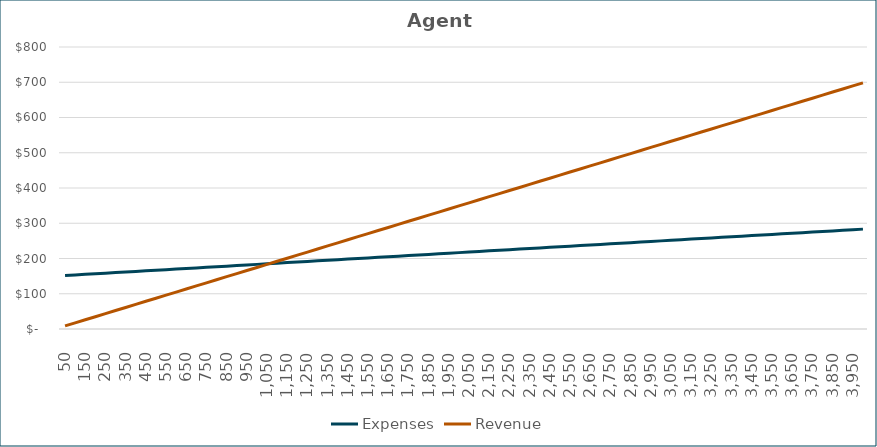
| Category | Expenses | Revenue |
|---|---|---|
| 50.0 | 151.667 | 8.73 |
| 100.0 | 153.333 | 17.46 |
| 150.0 | 155 | 26.19 |
| 200.0 | 156.667 | 34.92 |
| 250.0 | 158.333 | 43.65 |
| 300.0 | 160 | 52.38 |
| 350.0 | 161.667 | 61.11 |
| 400.0 | 163.333 | 69.84 |
| 450.0 | 165 | 78.57 |
| 500.0 | 166.667 | 87.3 |
| 550.0 | 168.333 | 96.03 |
| 600.0 | 170 | 104.76 |
| 650.0 | 171.667 | 113.49 |
| 700.0 | 173.333 | 122.22 |
| 750.0 | 175 | 130.95 |
| 800.0 | 176.667 | 139.68 |
| 850.0 | 178.333 | 148.41 |
| 900.0 | 180 | 157.14 |
| 950.0 | 181.667 | 165.87 |
| 1000.0 | 183.333 | 174.6 |
| 1050.0 | 185 | 183.33 |
| 1100.0 | 186.667 | 192.06 |
| 1150.0 | 188.333 | 200.79 |
| 1200.0 | 190 | 209.52 |
| 1250.0 | 191.667 | 218.25 |
| 1300.0 | 193.333 | 226.98 |
| 1350.0 | 195 | 235.71 |
| 1400.0 | 196.667 | 244.44 |
| 1450.0 | 198.333 | 253.17 |
| 1500.0 | 200 | 261.9 |
| 1550.0 | 201.667 | 270.63 |
| 1600.0 | 203.333 | 279.36 |
| 1650.0 | 205 | 288.09 |
| 1700.0 | 206.667 | 296.82 |
| 1750.0 | 208.333 | 305.55 |
| 1800.0 | 210 | 314.28 |
| 1850.0 | 211.667 | 323.01 |
| 1900.0 | 213.333 | 331.74 |
| 1950.0 | 215 | 340.47 |
| 2000.0 | 216.667 | 349.2 |
| 2050.0 | 218.333 | 357.93 |
| 2100.0 | 220 | 366.66 |
| 2150.0 | 221.667 | 375.39 |
| 2200.0 | 223.333 | 384.12 |
| 2250.0 | 225 | 392.85 |
| 2300.0 | 226.667 | 401.58 |
| 2350.0 | 228.333 | 410.31 |
| 2400.0 | 230 | 419.04 |
| 2450.0 | 231.667 | 427.77 |
| 2500.0 | 233.333 | 436.5 |
| 2550.0 | 235 | 445.23 |
| 2600.0 | 236.667 | 453.96 |
| 2650.0 | 238.333 | 462.69 |
| 2700.0 | 240 | 471.42 |
| 2750.0 | 241.667 | 480.15 |
| 2800.0 | 243.333 | 488.88 |
| 2850.0 | 245 | 497.61 |
| 2900.0 | 246.667 | 506.34 |
| 2950.0 | 248.333 | 515.07 |
| 3000.0 | 250 | 523.8 |
| 3050.0 | 251.667 | 532.53 |
| 3100.0 | 253.333 | 541.26 |
| 3150.0 | 255 | 549.99 |
| 3200.0 | 256.667 | 558.72 |
| 3250.0 | 258.333 | 567.45 |
| 3300.0 | 260 | 576.18 |
| 3350.0 | 261.667 | 584.91 |
| 3400.0 | 263.333 | 593.64 |
| 3450.0 | 265 | 602.37 |
| 3500.0 | 266.667 | 611.1 |
| 3550.0 | 268.333 | 619.83 |
| 3600.0 | 270 | 628.56 |
| 3650.0 | 271.667 | 637.29 |
| 3700.0 | 273.333 | 646.02 |
| 3750.0 | 275 | 654.75 |
| 3800.0 | 276.667 | 663.48 |
| 3850.0 | 278.333 | 672.21 |
| 3900.0 | 280 | 680.94 |
| 3950.0 | 281.667 | 689.67 |
| 4000.0 | 283.333 | 698.4 |